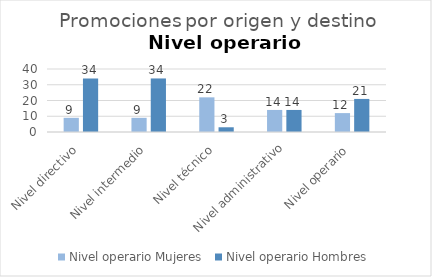
| Category | Nivel operario |
|---|---|
| Nivel directivo | 34 |
| Nivel intermedio | 34 |
| Nivel técnico | 3 |
| Nivel administrativo | 14 |
| Nivel operario | 21 |